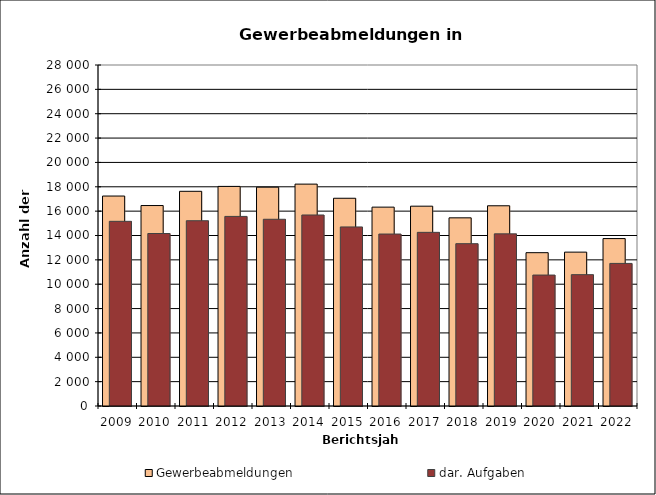
| Category | Gewerbeabmeldungen | dar. Aufgaben |
|---|---|---|
| 2009.0 | 17240 | 15163 |
| 2010.0 | 16460 | 14163 |
| 2011.0 | 17629 | 15213 |
| 2012.0 | 18032 | 15567 |
| 2013.0 | 17968 | 15333 |
| 2014.0 | 18219 | 15684 |
| 2015.0 | 17058 | 14703 |
| 2016.0 | 16329 | 14120 |
| 2017.0 | 16407 | 14259 |
| 2018.0 | 15450 | 13328 |
| 2019.0 | 16441 | 14135 |
| 2020.0 | 12589 | 10752 |
| 2021.0 | 12634 | 10784 |
| 2022.0 | 13748 | 11708 |